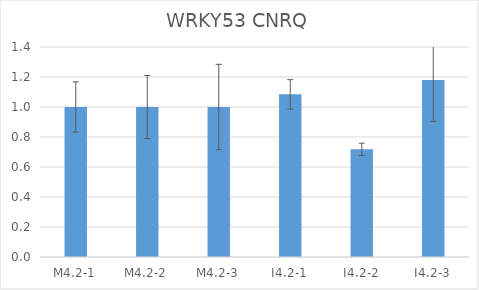
| Category | WRKY53 CNRQ |
|---|---|
| M4.2-1 | 1 |
| M4.2-2 | 1 |
| M4.2-3 | 1 |
| I4.2-1 | 1.084 |
| I4.2-2 | 0.718 |
| I4.2-3 | 1.18 |